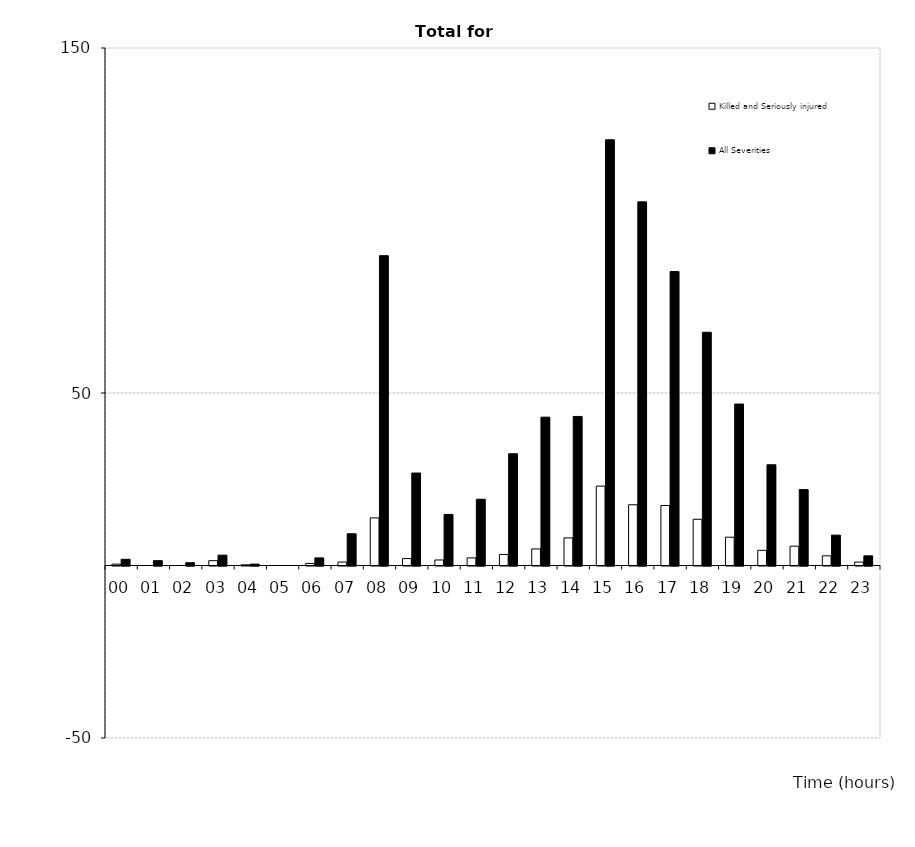
| Category | Killed and Seriously injured | All Severities |
|---|---|---|
| 00 | 0.4 | 1.8 |
| 01 | 0 | 1.4 |
| 02 | 0 | 0.8 |
| 03 | 1.4 | 3 |
| 04 | 0.2 | 0.4 |
| 05 | 0 | 0 |
| 06 | 0.6 | 2.2 |
| 07 | 1 | 9.2 |
| 08 | 13.8 | 89.8 |
| 09 | 2 | 26.8 |
| 10 | 1.6 | 14.8 |
| 11 | 2.2 | 19.2 |
| 12 | 3.2 | 32.4 |
| 13 | 4.8 | 43 |
| 14 | 8 | 43.2 |
| 15 | 23 | 123.4 |
| 16 | 17.6 | 105.4 |
| 17 | 17.4 | 85.2 |
| 18 | 13.4 | 67.6 |
| 19 | 8.2 | 46.8 |
| 20 | 4.4 | 29.2 |
| 21 | 5.6 | 22 |
| 22 | 2.8 | 8.8 |
| 23 | 1 | 2.8 |